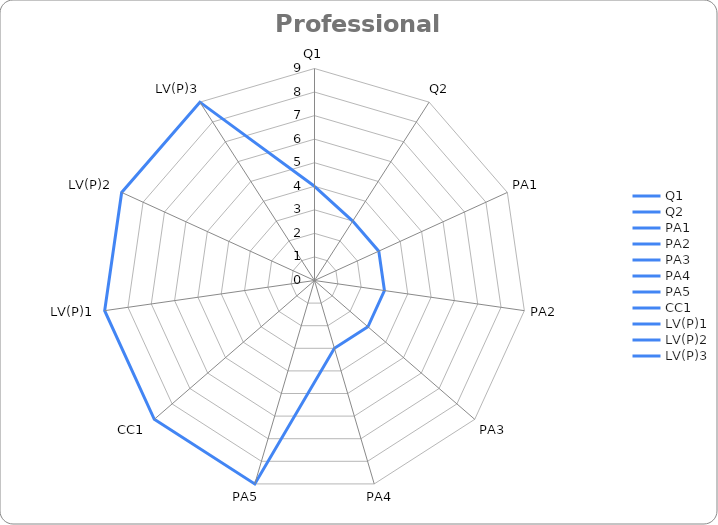
| Category | Series 0 |
|---|---|
| Q1 | 4 |
| Q2 | 3 |
| PA1 | 3 |
| PA2 | 3 |
| PA3 | 3 |
| PA4 | 3 |
| PA5 | 9 |
| CC1 | 9 |
| LV(P)1 | 9 |
| LV(P)2 | 9 |
| LV(P)3 | 9 |